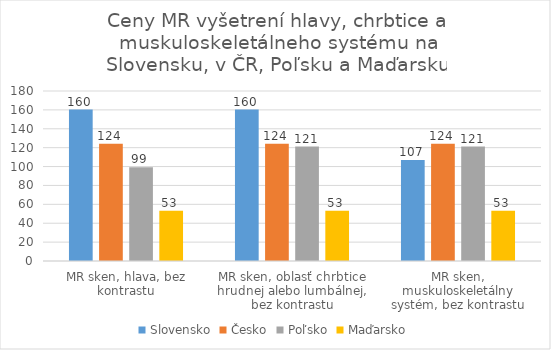
| Category | Slovensko | Česko | Poľsko | Maďarsko |
|---|---|---|---|---|
| MR sken, hlava, bez kontrastu | 160.32 | 124.134 | 99.184 | 53.239 |
| MR sken, oblasť chrbtice hrudnej alebo lumbálnej, bez kontrastu | 160.32 | 124.134 | 121.226 | 53.239 |
| MR sken, muskuloskeletálny systém, bez kontrastu | 106.88 | 124.134 | 121.226 | 53.239 |